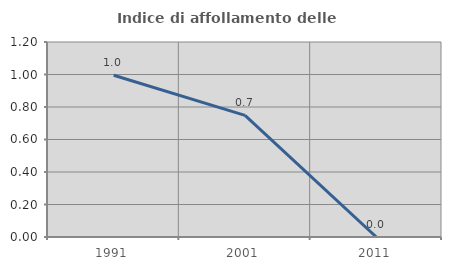
| Category | Indice di affollamento delle abitazioni  |
|---|---|
| 1991.0 | 0.995 |
| 2001.0 | 0.748 |
| 2011.0 | 0 |